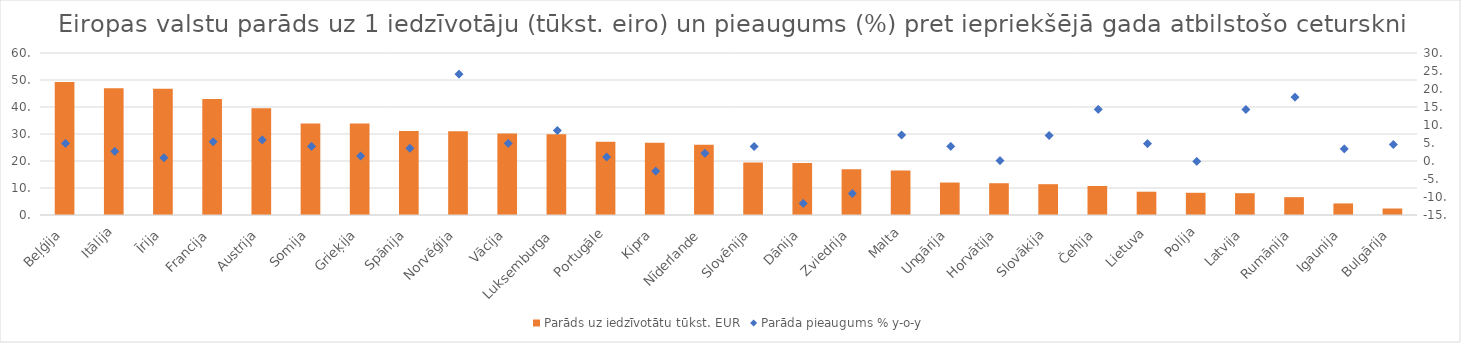
| Category | Parāds uz iedzīvotātu tūkst. EUR |
|---|---|
|  Beļģija | 49.291 |
| Itālija | 46.928 |
| Īrija | 46.758 |
| Francija | 42.994 |
| Austrija | 39.493 |
| Somija | 33.913 |
| Grieķija | 33.866 |
| Spānija | 31.104 |
| Norvēģija | 30.977 |
| Vācija | 30.215 |
| Luksemburga | 29.917 |
| Portugāle | 27.107 |
| Kipra | 26.728 |
| Nīderlande | 26.015 |
| Slovēnija | 19.482 |
| Dānija | 19.305 |
| Zviedrija | 16.979 |
| Malta | 16.506 |
| Ungārija | 12.025 |
| Horvātija | 11.766 |
| Slovākija | 11.412 |
| Čehija | 10.738 |
| Lietuva | 8.633 |
| Polija | 8.23 |
| Latvija | 8.075 |
| Rumānija | 6.604 |
| Igaunija | 4.287 |
| Bulgārija | 2.404 |